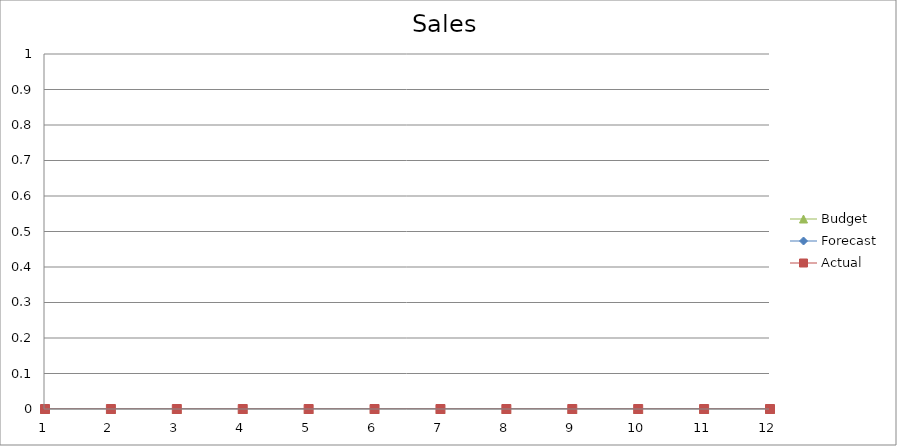
| Category | Budget | Forecast | Actual |
|---|---|---|---|
| 0 | 1540 | 2090 | 1040 |
| 1 | 1810 | 2610 | 2070 |
| 2 | 1650 | 2970 | 2230 |
| 3 | 3430 | 3100 | 610 |
| 4 | 500 | 790 | 3060 |
| 5 | 1060 | 1970 | 2570 |
| 6 | 1930 | 3330 | 3190 |
| 7 | 1510 | 950 | 2990 |
| 8 | 1180 | 3430 | 3100 |
| 9 | 2090 | 1040 | 1640 |
| 10 | 3280 | 3030 | 2310 |
| 11 | 1010 | 1010 | 2370 |